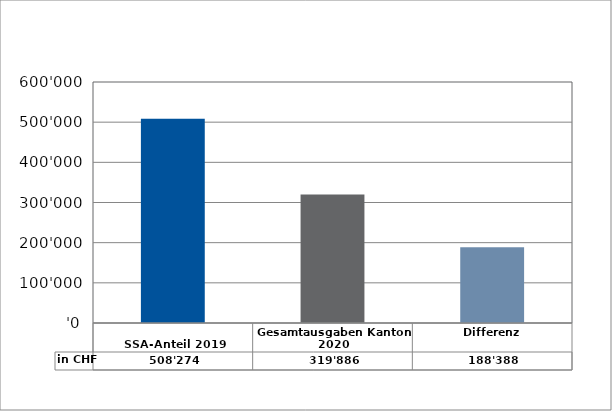
| Category | in CHF |
|---|---|
| 
SSA-Anteil 2019

 | 508274.1 |
| Gesamtausgaben Kanton 2020
 | 319885.85 |
| Differenz | 188388.25 |